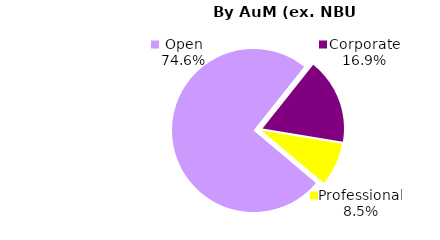
| Category | Series 0 |
|---|---|
| Open | 1233.068 |
| Corporate | 279.898 |
| Professional | 140.455 |